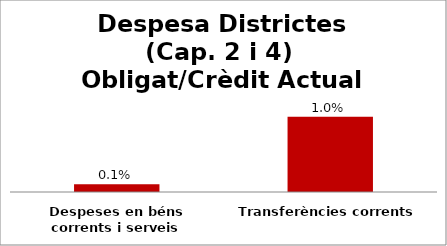
| Category | Series 0 |
|---|---|
| Despeses en béns corrents i serveis | 0.001 |
| Transferències corrents | 0.01 |